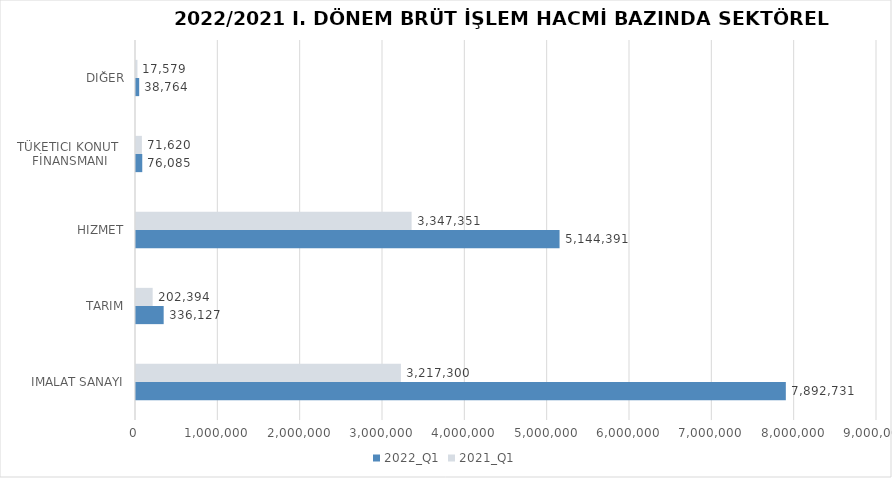
| Category | 2022_Q1 | 2021_Q1 |
|---|---|---|
| İMALAT SANAYİ | 7892731.388 | 3217299.68 |
| TARIM | 336127.332 | 202393.634 |
| HİZMET | 5144391.017 | 3347350.986 |
| TÜKETİCİ KONUT 
FİNANSMANI | 76085 | 71620 |
| DİĞER | 38764 | 17579 |